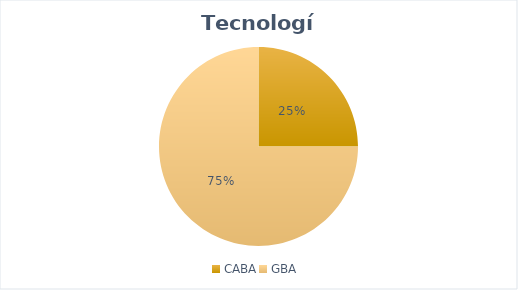
| Category | Series 0 |
|---|---|
| CABA | 2 |
| GBA  | 6 |